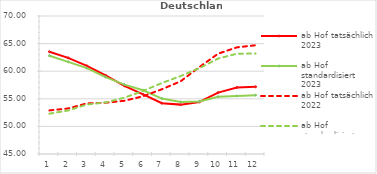
| Category | ab Hof tatsächlich 2023 | ab Hof standardisiert 2023 | ab Hof tatsächlich 2022 | ab Hof standardisiert 2022 |
|---|---|---|---|---|
| 0 | 63.531 | 62.802 | 52.893 | 52.303 |
| 1 | 62.419 | 61.695 | 53.251 | 52.882 |
| 2 | 60.971 | 60.559 | 54.162 | 53.961 |
| 3 | 59.23 | 58.933 | 54.295 | 54.343 |
| 4 | 57.35 | 57.573 | 54.64 | 55.203 |
| 5 | 55.802 | 56.548 | 55.46 | 56.435 |
| 6 | 54.212 | 55.039 | 56.727 | 57.859 |
| 7 | 53.945 | 54.44 | 58.175 | 59.123 |
| 8 | 54.431 | 54.523 | 60.754 | 60.553 |
| 9 | 56.121 | 55.364 | 63.173 | 62.287 |
| 10 | 57.051 | 55.511 | 64.319 | 63.17 |
| 11 | 57.18 | 55.663 | 64.702 | 63.2 |